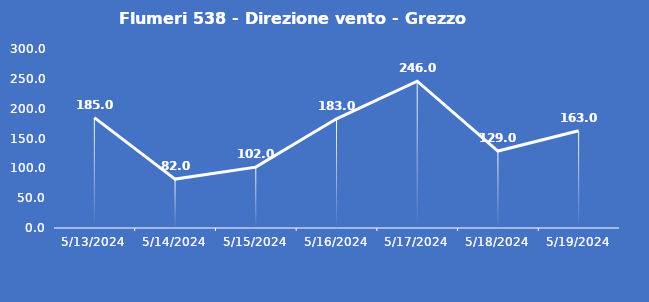
| Category | Flumeri 538 - Direzione vento - Grezzo (°N) |
|---|---|
| 5/13/24 | 185 |
| 5/14/24 | 82 |
| 5/15/24 | 102 |
| 5/16/24 | 183 |
| 5/17/24 | 246 |
| 5/18/24 | 129 |
| 5/19/24 | 163 |